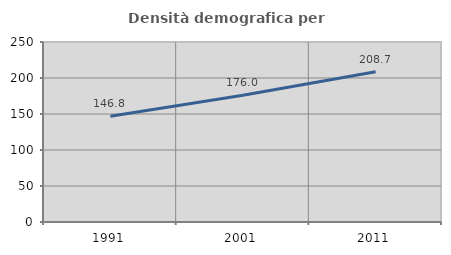
| Category | Densità demografica |
|---|---|
| 1991.0 | 146.79 |
| 2001.0 | 176.004 |
| 2011.0 | 208.704 |